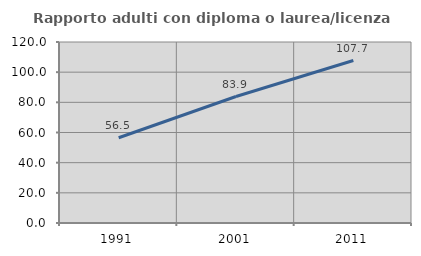
| Category | Rapporto adulti con diploma o laurea/licenza media  |
|---|---|
| 1991.0 | 56.506 |
| 2001.0 | 83.851 |
| 2011.0 | 107.704 |